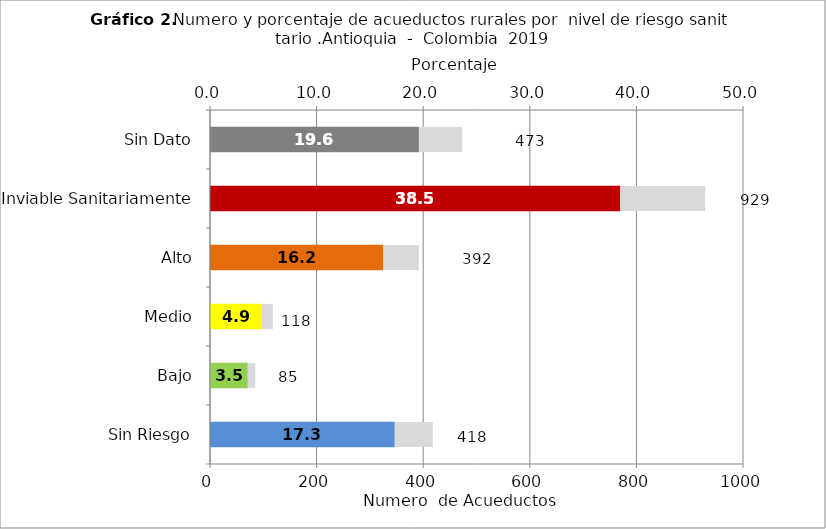
| Category | Número de Sistemas |
|---|---|
| Sin Riesgo | 418 |
| Bajo | 85 |
| Medio | 118 |
| Alto | 392 |
| Inviable Sanitariamente | 929 |
| Sin Dato | 473 |